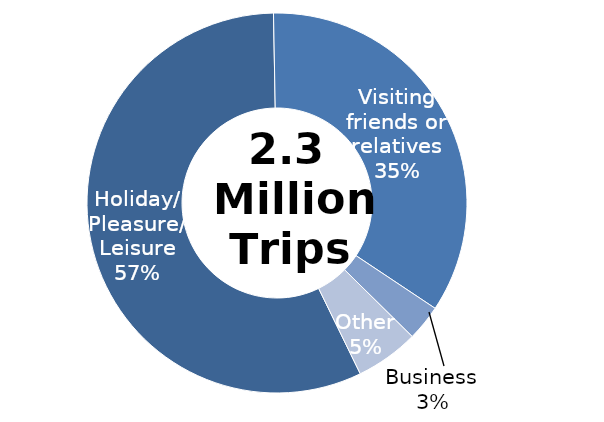
| Category | Series 0 |
|---|---|
| Holiday/ Pleasure/ Leisure | 1329052.652 |
| Visiting friends or relatives | 808902.016 |
| Business | 71210.808 |
| Other | 125461.349 |